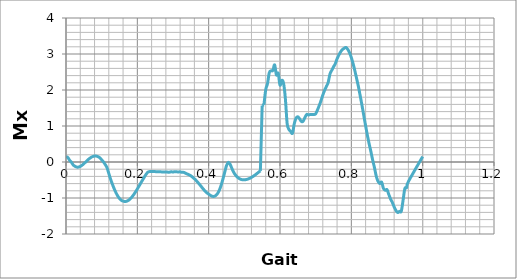
| Category | Series 0 |
|---|---|
| 0.0 | 0.15 |
| 0.005 | 0.127 |
| 0.01 | 0.051 |
| 0.015 | -0.005 |
| 0.02 | -0.079 |
| 0.025 | -0.119 |
| 0.03 | -0.141 |
| 0.035 | -0.141 |
| 0.04 | -0.122 |
| 0.045 | -0.09 |
| 0.05 | -0.048 |
| 0.055 | -0.001 |
| 0.06 | 0.046 |
| 0.065 | 0.09 |
| 0.07 | 0.126 |
| 0.075 | 0.152 |
| 0.08 | 0.165 |
| 0.085 | 0.163 |
| 0.09 | 0.147 |
| 0.095 | 0.115 |
| 0.1 | 0.061 |
| 0.105 | 0.003 |
| 0.11 | -0.071 |
| 0.115 | -0.16 |
| 0.12 | -0.317 |
| 0.125 | -0.476 |
| 0.13 | -0.615 |
| 0.135 | -0.741 |
| 0.14 | -0.851 |
| 0.145 | -0.943 |
| 0.15 | -1.015 |
| 0.155 | -1.063 |
| 0.16 | -1.086 |
| 0.165 | -1.097 |
| 0.17 | -1.09 |
| 0.175 | -1.065 |
| 0.18 | -1.025 |
| 0.185 | -0.97 |
| 0.19 | -0.905 |
| 0.195 | -0.83 |
| 0.2 | -0.749 |
| 0.205 | -0.665 |
| 0.21 | -0.579 |
| 0.215 | -0.494 |
| 0.22 | -0.413 |
| 0.225 | -0.336 |
| 0.23 | -0.28 |
| 0.235 | -0.266 |
| 0.24 | -0.264 |
| 0.245 | -0.265 |
| 0.25 | -0.267 |
| 0.255 | -0.273 |
| 0.26 | -0.271 |
| 0.265 | -0.273 |
| 0.27 | -0.276 |
| 0.275 | -0.278 |
| 0.28 | -0.279 |
| 0.285 | -0.281 |
| 0.29 | -0.282 |
| 0.295 | -0.272 |
| 0.3 | -0.278 |
| 0.305 | -0.269 |
| 0.31 | -0.273 |
| 0.315 | -0.276 |
| 0.32 | -0.274 |
| 0.325 | -0.288 |
| 0.33 | -0.288 |
| 0.335 | -0.31 |
| 0.34 | -0.334 |
| 0.345 | -0.355 |
| 0.35 | -0.383 |
| 0.355 | -0.423 |
| 0.36 | -0.466 |
| 0.365 | -0.515 |
| 0.37 | -0.571 |
| 0.375 | -0.63 |
| 0.38 | -0.691 |
| 0.385 | -0.752 |
| 0.39 | -0.809 |
| 0.395 | -0.857 |
| 0.4 | -0.892 |
| 0.405 | -0.929 |
| 0.41 | -0.952 |
| 0.415 | -0.954 |
| 0.42 | -0.932 |
| 0.425 | -0.876 |
| 0.43 | -0.781 |
| 0.435 | -0.645 |
| 0.44 | -0.474 |
| 0.445 | -0.283 |
| 0.45 | -0.101 |
| 0.455 | -0.01 |
| 0.46 | -0.061 |
| 0.465 | -0.176 |
| 0.47 | -0.283 |
| 0.475 | -0.359 |
| 0.48 | -0.414 |
| 0.485 | -0.454 |
| 0.49 | -0.481 |
| 0.495 | -0.494 |
| 0.5 | -0.496 |
| 0.505 | -0.488 |
| 0.51 | -0.474 |
| 0.515 | -0.453 |
| 0.52 | -0.427 |
| 0.525 | -0.396 |
| 0.53 | -0.362 |
| 0.535 | -0.324 |
| 0.54 | -0.284 |
| 0.545 | -0.246 |
| 0.55 | 1.57 |
| 0.555 | 1.589 |
| 0.56 | 2.01 |
| 0.565 | 2.177 |
| 0.57 | 2.484 |
| 0.575 | 2.533 |
| 0.58 | 2.541 |
| 0.585 | 2.697 |
| 0.59 | 2.417 |
| 0.595 | 2.465 |
| 0.6 | 2.135 |
| 0.605 | 2.268 |
| 0.61 | 2.185 |
| 0.615 | 1.766 |
| 0.62 | 1.073 |
| 0.625 | 0.905 |
| 0.63 | 0.851 |
| 0.635 | 0.799 |
| 0.64 | 1.063 |
| 0.645 | 1.218 |
| 0.65 | 1.257 |
| 0.655 | 1.2 |
| 0.66 | 1.126 |
| 0.665 | 1.136 |
| 0.67 | 1.241 |
| 0.675 | 1.322 |
| 0.68 | 1.306 |
| 0.685 | 1.322 |
| 0.69 | 1.317 |
| 0.695 | 1.318 |
| 0.7 | 1.338 |
| 0.705 | 1.445 |
| 0.71 | 1.568 |
| 0.715 | 1.704 |
| 0.72 | 1.858 |
| 0.725 | 1.988 |
| 0.73 | 2.097 |
| 0.735 | 2.207 |
| 0.74 | 2.442 |
| 0.745 | 2.546 |
| 0.75 | 2.643 |
| 0.755 | 2.73 |
| 0.76 | 2.866 |
| 0.765 | 2.971 |
| 0.77 | 3.06 |
| 0.775 | 3.124 |
| 0.78 | 3.159 |
| 0.785 | 3.183 |
| 0.79 | 3.128 |
| 0.795 | 3.033 |
| 0.8 | 2.899 |
| 0.805 | 2.73 |
| 0.81 | 2.53 |
| 0.815 | 2.311 |
| 0.82 | 2.088 |
| 0.825 | 1.832 |
| 0.83 | 1.567 |
| 0.835 | 1.284 |
| 0.84 | 1.007 |
| 0.845 | 0.741 |
| 0.85 | 0.502 |
| 0.855 | 0.283 |
| 0.86 | 0.046 |
| 0.865 | -0.163 |
| 0.87 | -0.399 |
| 0.875 | -0.541 |
| 0.88 | -0.6 |
| 0.885 | -0.561 |
| 0.89 | -0.732 |
| 0.895 | -0.785 |
| 0.9 | -0.768 |
| 0.905 | -0.9 |
| 0.91 | -1.028 |
| 0.915 | -1.123 |
| 0.92 | -1.248 |
| 0.925 | -1.345 |
| 0.93 | -1.404 |
| 0.935 | -1.371 |
| 0.94 | -1.37 |
| 0.945 | -1.068 |
| 0.95 | -0.739 |
| 0.955 | -0.712 |
| 0.96 | -0.544 |
| 1.0 | 0.15 |